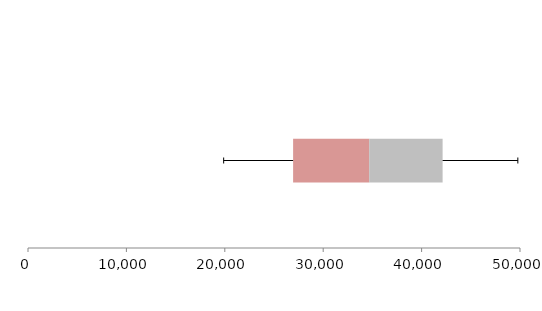
| Category | Series 1 | Series 2 | Series 3 |
|---|---|---|---|
| 0 | 26942.369 | 7732.69 | 7460.17 |